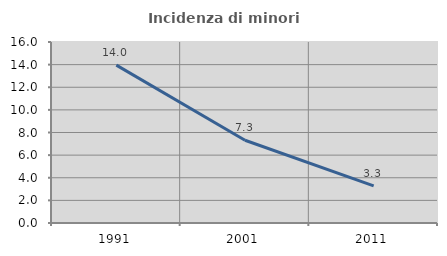
| Category | Incidenza di minori stranieri |
|---|---|
| 1991.0 | 13.953 |
| 2001.0 | 7.317 |
| 2011.0 | 3.279 |